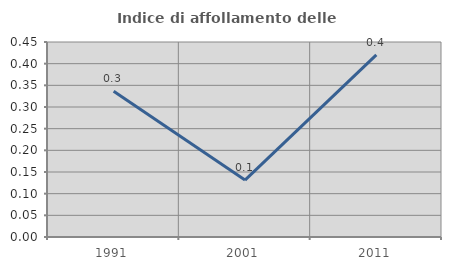
| Category | Indice di affollamento delle abitazioni  |
|---|---|
| 1991.0 | 0.336 |
| 2001.0 | 0.131 |
| 2011.0 | 0.42 |